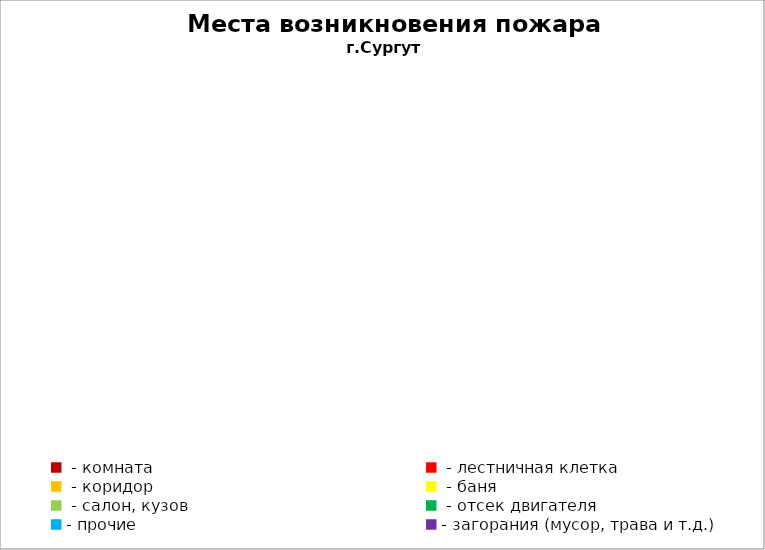
| Category | Места возникновения пожара |
|---|---|
|  - комната | 79 |
|  - лестничная клетка | 16 |
|  - коридор | 11 |
|  - баня | 44 |
|  - салон, кузов | 28 |
|  - отсек двигателя | 50 |
| - прочие | 110 |
| - загорания (мусор, трава и т.д.)  | 166 |